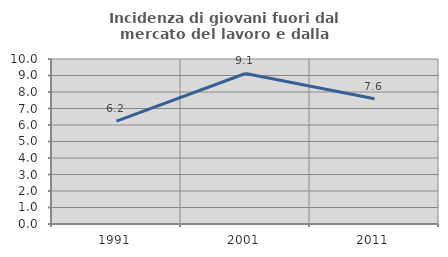
| Category | Incidenza di giovani fuori dal mercato del lavoro e dalla formazione  |
|---|---|
| 1991.0 | 6.233 |
| 2001.0 | 9.122 |
| 2011.0 | 7.589 |